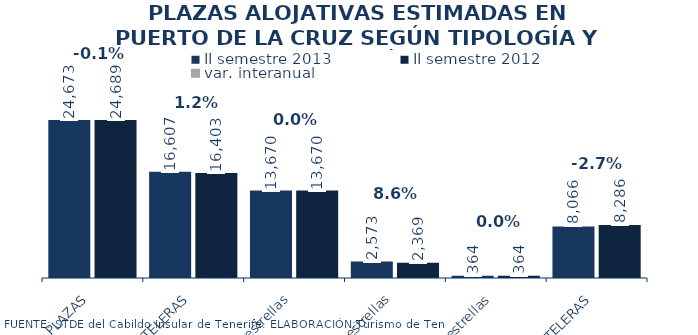
| Category | II semestre 2013 | II semestre 2012 |
|---|---|---|
| TOTAL PLAZAS | 24673 | 24689 |
| HOTELERAS | 16607 | 16403 |
| 4 y 5 estrellas | 13670 | 13670 |
| 3 estrellas | 2573 | 2369 |
| 1 Y 2 estrellas | 364 | 364 |
| EXTRAHOTELERAS | 8066 | 8286 |